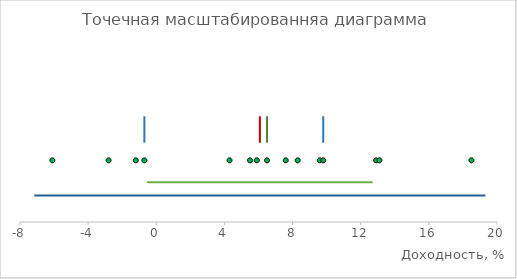
| Category | Количество |
|---|---|
| -6.1 | 1 |
| -2.8 | 1 |
| -1.2 | 1 |
| -0.7 | 1 |
| 4.3 | 1 |
| 5.5 | 1 |
| 5.9 | 1 |
| 6.5 | 1 |
| 7.6 | 1 |
| 8.3 | 1 |
| 9.6 | 1 |
| 9.8 | 1 |
| 12.9 | 1 |
| 13.1 | 1 |
| 18.5 | 1 |